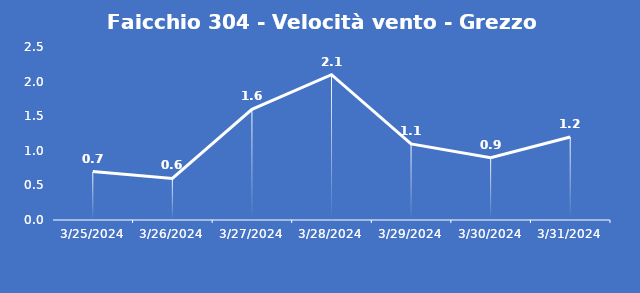
| Category | Faicchio 304 - Velocità vento - Grezzo (m/s) |
|---|---|
| 3/25/24 | 0.7 |
| 3/26/24 | 0.6 |
| 3/27/24 | 1.6 |
| 3/28/24 | 2.1 |
| 3/29/24 | 1.1 |
| 3/30/24 | 0.9 |
| 3/31/24 | 1.2 |